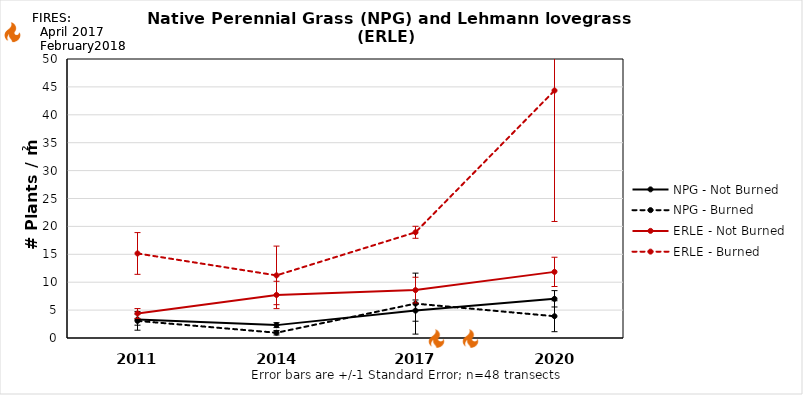
| Category | NPG - Not Burned | NPG - Burned | ERLE - Not Burned | ERLE - Burned |
|---|---|---|---|---|
| 2011.0 | 3.301 | 3.068 | 4.394 | 15.15 |
| 2014.0 | 2.308 | 0.942 | 7.715 | 11.221 |
| 2017.0 | 4.912 | 6.162 | 8.582 | 18.944 |
| 2020.0 | 7.026 | 3.902 | 11.851 | 44.347 |